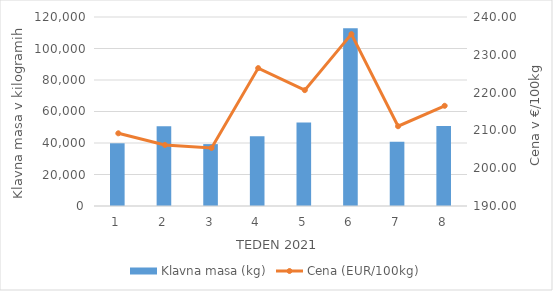
| Category | Klavna masa (kg) |
|---|---|
| 1.0 | 39814 |
| 2.0 | 50603 |
| 3.0 | 39295 |
| 4.0 | 44250 |
| 5.0 | 53061 |
| 6.0 | 112816 |
| 7.0 | 40829 |
| 8.0 | 50775 |